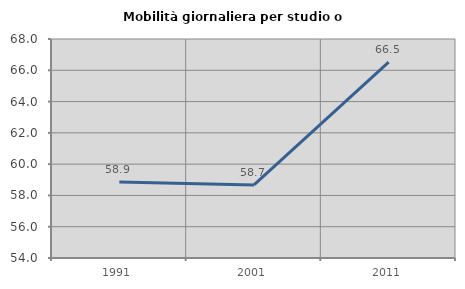
| Category | Mobilità giornaliera per studio o lavoro |
|---|---|
| 1991.0 | 58.854 |
| 2001.0 | 58.668 |
| 2011.0 | 66.524 |